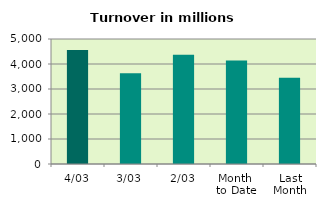
| Category | Series 0 |
|---|---|
| 4/03 | 4561.546 |
| 3/03 | 3630.558 |
| 2/03 | 4374.24 |
| Month 
to Date | 4140.79 |
| Last
Month | 3445.759 |